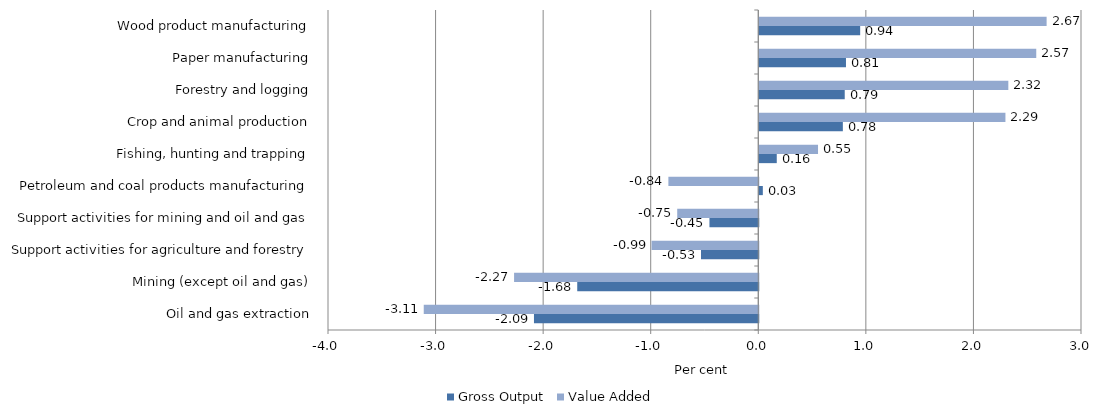
| Category | Gross Output | Value Added |
|---|---|---|
| Oil and gas extraction | -2.085 | -3.11 |
| Mining (except oil and gas) | -1.683 | -2.27 |
| Support activities for agriculture and forestry | -0.533 | -0.992 |
| Support activities for mining and oil and gas | -0.454 | -0.754 |
| Petroleum and coal products manufacturing | 0.033 | -0.836 |
| Fishing, hunting and trapping | 0.163 | 0.546 |
| Crop and animal production | 0.777 | 2.288 |
| Forestry and logging | 0.794 | 2.315 |
| Paper manufacturing | 0.806 | 2.575 |
| Wood product manufacturing | 0.938 | 2.671 |